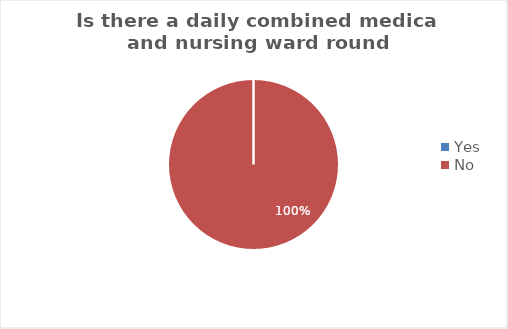
| Category | Is there a daily combined medical and nursing ward round documented? |
|---|---|
| Yes | 0 |
| No | 1 |